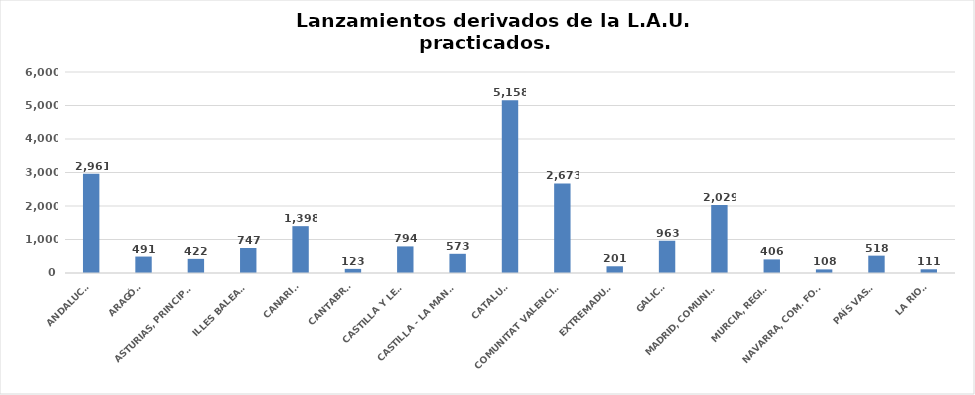
| Category | Series 0 |
|---|---|
| ANDALUCÍA | 2961 |
| ARAGÓN | 491 |
| ASTURIAS, PRINCIPADO | 422 |
| ILLES BALEARS | 747 |
| CANARIAS | 1398 |
| CANTABRIA | 123 |
| CASTILLA Y LEÓN | 794 |
| CASTILLA - LA MANCHA | 573 |
| CATALUÑA | 5158 |
| COMUNITAT VALENCIANA | 2673 |
| EXTREMADURA | 201 |
| GALICIA | 963 |
| MADRID, COMUNIDAD | 2029 |
| MURCIA, REGIÓN | 406 |
| NAVARRA, COM. FORAL | 108 |
| PAÍS VASCO | 518 |
| LA RIOJA | 111 |